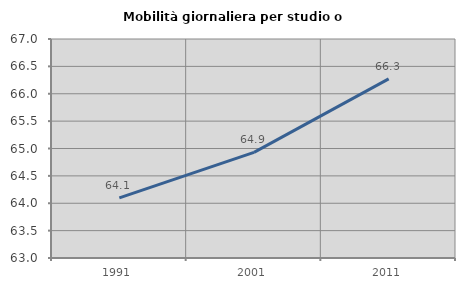
| Category | Mobilità giornaliera per studio o lavoro |
|---|---|
| 1991.0 | 64.099 |
| 2001.0 | 64.93 |
| 2011.0 | 66.271 |